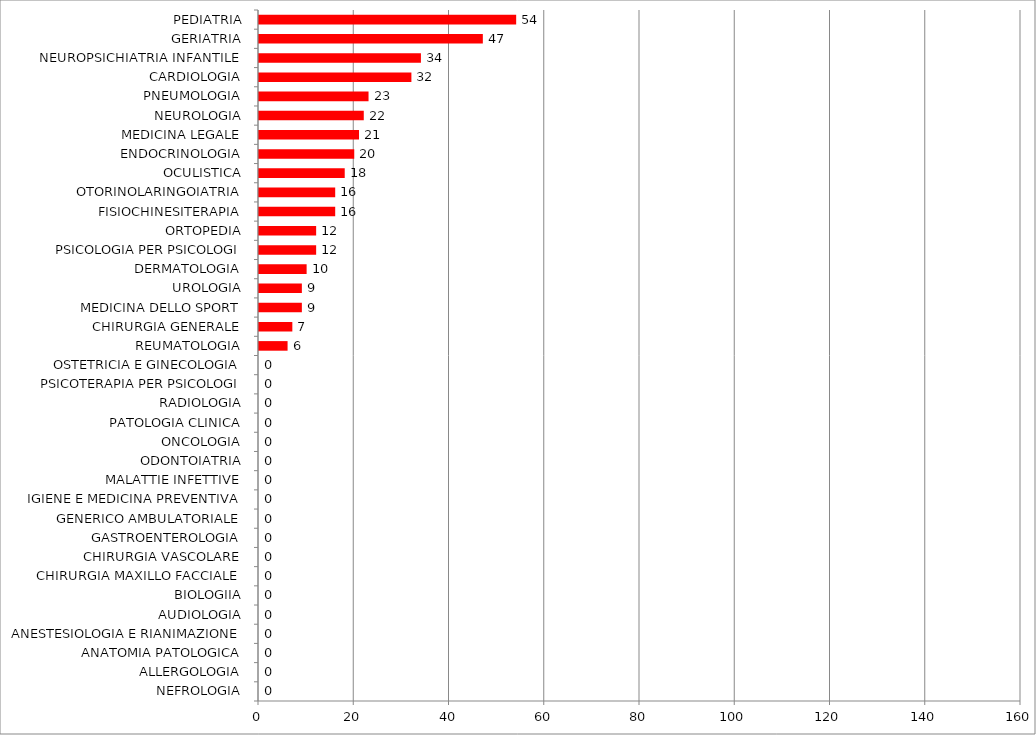
| Category | Series 0 |
|---|---|
| NEFROLOGIA | 0 |
| ALLERGOLOGIA | 0 |
| ANATOMIA PATOLOGICA | 0 |
| ANESTESIOLOGIA E RIANIMAZIONE | 0 |
| AUDIOLOGIA | 0 |
| BIOLOGIIA | 0 |
| CHIRURGIA MAXILLO FACCIALE | 0 |
| CHIRURGIA VASCOLARE | 0 |
| GASTROENTEROLOGIA | 0 |
| GENERICO AMBULATORIALE | 0 |
| IGIENE E MEDICINA PREVENTIVA | 0 |
| MALATTIE INFETTIVE | 0 |
| ODONTOIATRIA | 0 |
| ONCOLOGIA | 0 |
| PATOLOGIA CLINICA | 0 |
| RADIOLOGIA | 0 |
| PSICOTERAPIA PER PSICOLOGI | 0 |
| OSTETRICIA E GINECOLOGIA | 0 |
| REUMATOLOGIA | 6 |
| CHIRURGIA GENERALE | 7 |
| MEDICINA DELLO SPORT | 9 |
| UROLOGIA | 9 |
| DERMATOLOGIA | 10 |
| PSICOLOGIA PER PSICOLOGI | 12 |
| ORTOPEDIA | 12 |
| FISIOCHINESITERAPIA | 16 |
| OTORINOLARINGOIATRIA | 16 |
| OCULISTICA | 18 |
| ENDOCRINOLOGIA | 20 |
| MEDICINA LEGALE | 21 |
| NEUROLOGIA | 22 |
| PNEUMOLOGIA | 23 |
| CARDIOLOGIA | 32 |
| NEUROPSICHIATRIA INFANTILE | 34 |
| GERIATRIA | 47 |
| PEDIATRIA | 54 |